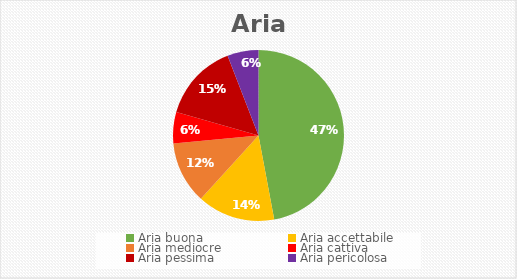
| Category | Series 0 |
|---|---|
| Aria buona | 16 |
| Aria accettabile | 5 |
| Aria mediocre | 4 |
| Aria cattiva | 2 |
| Aria pessima | 5 |
| Aria pericolosa | 2 |